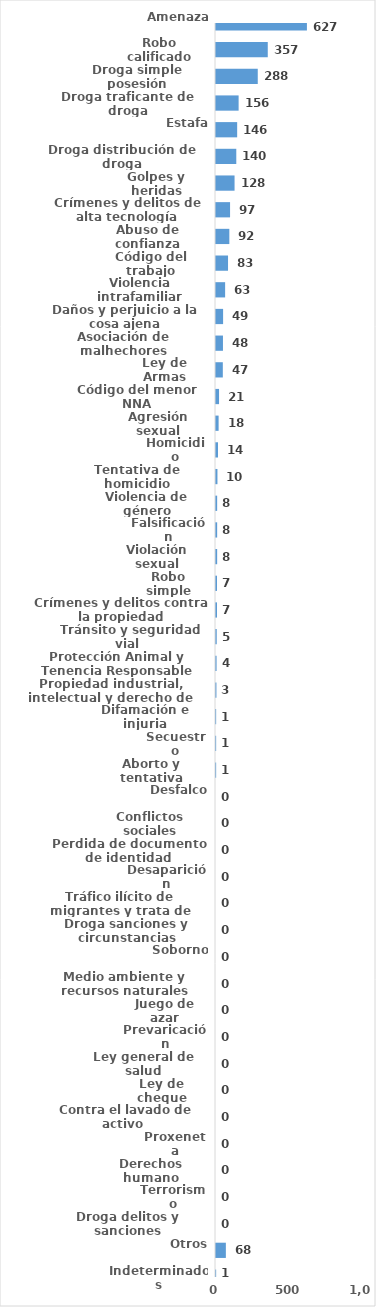
| Category | Series 0 |
|---|---|
| Amenaza | 627 |
| Robo calificado | 357 |
| Droga simple posesión | 288 |
| Droga traficante de droga | 156 |
| Estafa | 146 |
| Droga distribución de droga | 140 |
| Golpes y heridas | 128 |
| Crímenes y delitos de alta tecnología | 97 |
| Abuso de confianza | 92 |
| Código del trabajo | 83 |
| Violencia intrafamiliar | 63 |
| Daños y perjuicio a la cosa ajena | 49 |
| Asociación de malhechores | 48 |
| Ley de Armas | 47 |
| Código del menor NNA | 21 |
| Agresión sexual | 18 |
| Homicidio | 14 |
| Tentativa de homicidio | 10 |
| Violencia de género | 8 |
| Falsificación | 8 |
| Violación sexual | 8 |
| Robo simple | 7 |
| Crímenes y delitos contra la propiedad | 7 |
| Tránsito y seguridad vial  | 5 |
| Protección Animal y Tenencia Responsable | 4 |
| Propiedad industrial, intelectual y derecho de autor | 3 |
| Difamación e injuria | 1 |
| Secuestro | 1 |
| Aborto y tentativa | 1 |
| Desfalco | 0 |
| Conflictos sociales | 0 |
| Perdida de documento de identidad | 0 |
| Desaparición | 0 |
| Tráfico ilícito de migrantes y trata de personas | 0 |
| Droga sanciones y circunstancias agravantes | 0 |
| Soborno | 0 |
| Medio ambiente y recursos naturales | 0 |
| Juego de azar | 0 |
| Prevaricación | 0 |
| Ley general de salud | 0 |
| Ley de cheque | 0 |
| Contra el lavado de activo  | 0 |
| Proxeneta | 0 |
| Derechos humano | 0 |
| Terrorismo | 0 |
| Droga delitos y sanciones | 0 |
| Otros | 68 |
| Indeterminados | 1 |